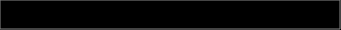
| Category | Series 0 |
|---|---|
| 0 | 0.02 |
| 1 | 0.082 |
| 2 | 0.315 |
| 3 | 0.22 |
| 4 | 0.363 |